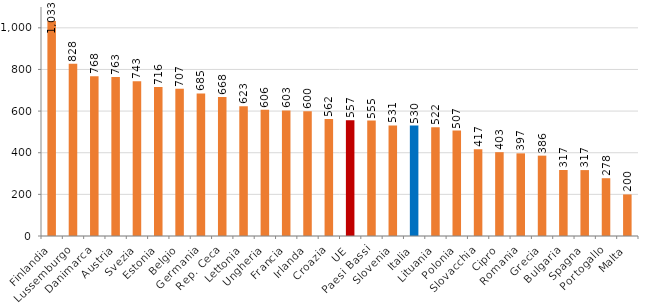
| Category | Series 0 |
|---|---|
| Finlandia | 1033.218 |
| Lussemburgo | 827.537 |
| Danimarca | 767.761 |
| Austria | 763.352 |
| Svezia | 743.142 |
| Estonia | 715.547 |
| Belgio | 707.438 |
| Germania | 685.053 |
| Rep. Ceca | 667.503 |
| Lettonia | 622.731 |
| Ungheria | 606.13 |
| Francia | 603.19 |
| Irlanda | 599.523 |
| Croazia | 561.803 |
| UE | 556.55 |
| Paesi Bassi | 554.503 |
| Slovenia | 530.817 |
| Italia | 530.391 |
| Lituania | 522.324 |
| Polonia | 506.662 |
| Slovacchia | 417.026 |
| Cipro | 402.681 |
| Romania | 396.99 |
| Grecia | 385.979 |
| Bulgaria | 317.146 |
| Spagna | 316.614 |
| Portogallo | 277.58 |
| Malta | 199.674 |